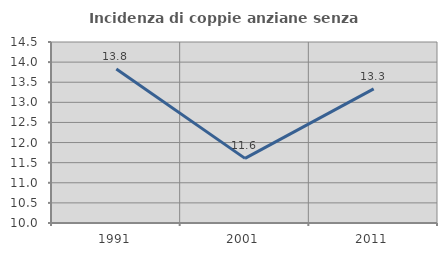
| Category | Incidenza di coppie anziane senza figli  |
|---|---|
| 1991.0 | 13.83 |
| 2001.0 | 11.607 |
| 2011.0 | 13.333 |